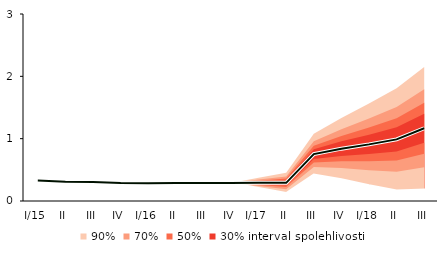
| Category | linka | Centerline |
|---|---|---|
| I/15 | 0.328 | 0.328 |
| II | 0.31 | 0.31 |
| III | 0.306 | 0.306 |
| IV | 0.29 | 0.29 |
| I/16 | 0.286 | 0.286 |
| II | 0.29 | 0.29 |
| III | 0.29 | 0.29 |
| IV | 0.289 | 0.289 |
| I/17 | 0.291 | 0.291 |
| II | 0.291 | 0.291 |
| III | 0.752 | 0.752 |
| IV | 0.84 | 0.84 |
| I/18 | 0.908 | 0.908 |
| II | 0.989 | 0.989 |
| III | 1.167 | 1.167 |